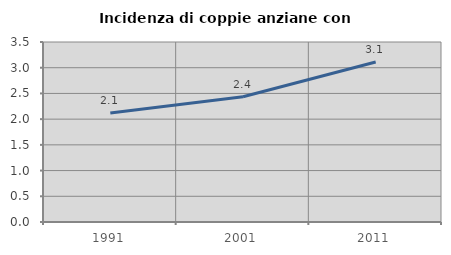
| Category | Incidenza di coppie anziane con figli |
|---|---|
| 1991.0 | 2.118 |
| 2001.0 | 2.436 |
| 2011.0 | 3.112 |